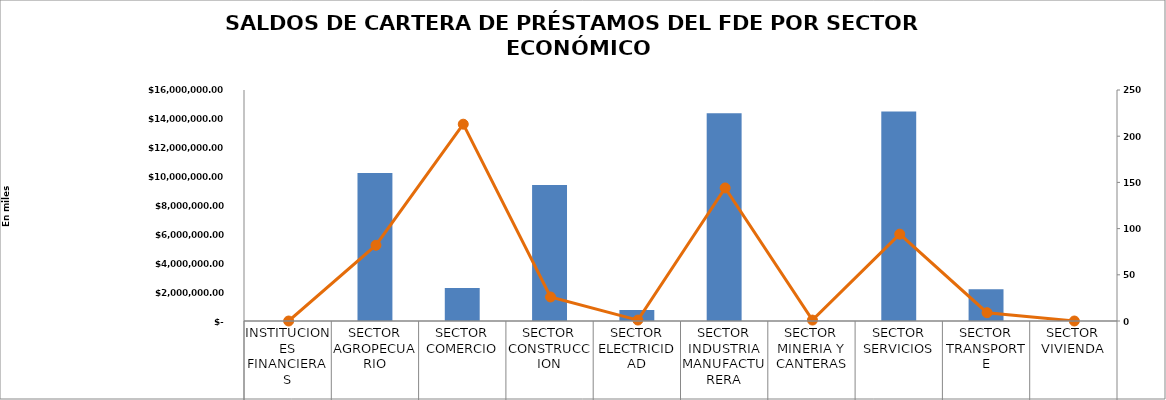
| Category |  Saldo del Crédito en Miles US$ |
|---|---|
| INSTITUCIONES FINANCIERAS | 0 |
| SECTOR AGROPECUARIO | 10246732.62 |
| SECTOR COMERCIO | 2290354.25 |
| SECTOR CONSTRUCCION | 9424709.98 |
| SECTOR ELECTRICIDAD | 770204.66 |
| SECTOR INDUSTRIA MANUFACTURERA | 14391417.01 |
| SECTOR MINERIA Y CANTERAS | 20509.61 |
| SECTOR SERVICIOS | 14505637.37 |
| SECTOR TRANSPORTE | 2194433.69 |
| SECTOR VIVIENDA | 0 |